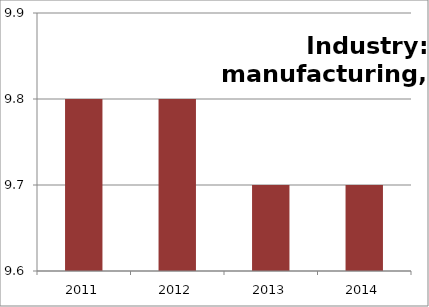
| Category | C: Manufacturing  |
|---|---|
| 2011.0 | 9.8 |
| 2012.0 | 9.8 |
| 2013.0 | 9.7 |
| 2014.0 | 9.7 |